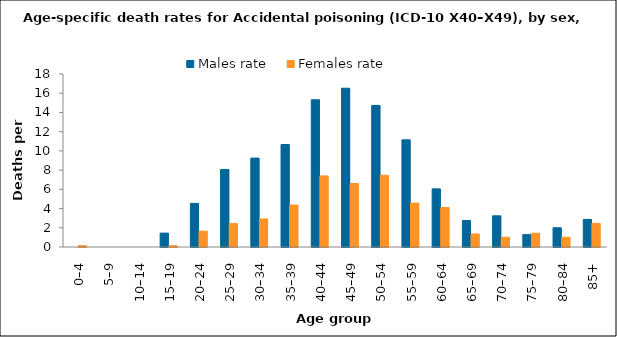
| Category | Males rate | Females rate |
|---|---|---|
| 0–4 | 0 | 0.136 |
| 5–9 | 0 | 0 |
| 10–14 | 0 | 0 |
| 15–19 | 1.444 | 0.139 |
| 20–24 | 4.539 | 1.653 |
| 25–29 | 8.057 | 2.435 |
| 30–34 | 9.25 | 2.919 |
| 35–39 | 10.665 | 4.366 |
| 40–44 | 15.321 | 7.393 |
| 45–49 | 16.518 | 6.605 |
| 50–54 | 14.733 | 7.463 |
| 55–59 | 11.147 | 4.569 |
| 60–64 | 6.046 | 4.112 |
| 65–69 | 2.753 | 1.358 |
| 70–74 | 3.245 | 1.013 |
| 75–79 | 1.289 | 1.431 |
| 80–84 | 2 | 1.015 |
| 85+ | 2.873 | 2.458 |